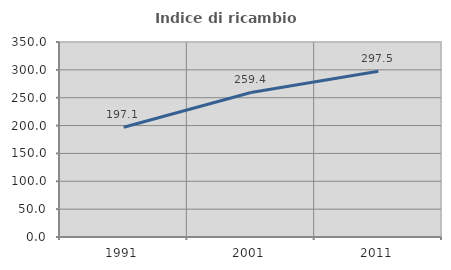
| Category | Indice di ricambio occupazionale  |
|---|---|
| 1991.0 | 197.087 |
| 2001.0 | 259.398 |
| 2011.0 | 297.521 |